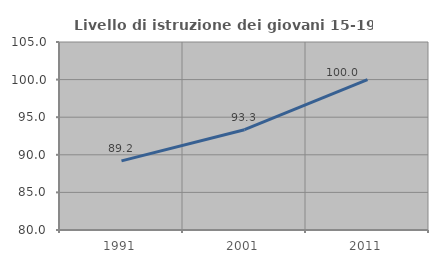
| Category | Livello di istruzione dei giovani 15-19 anni |
|---|---|
| 1991.0 | 89.189 |
| 2001.0 | 93.333 |
| 2011.0 | 100 |